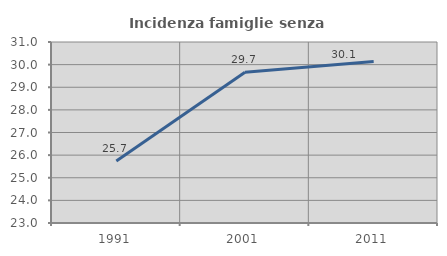
| Category | Incidenza famiglie senza nuclei |
|---|---|
| 1991.0 | 25.743 |
| 2001.0 | 29.664 |
| 2011.0 | 30.134 |